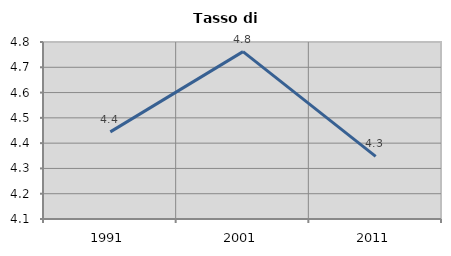
| Category | Tasso di disoccupazione   |
|---|---|
| 1991.0 | 4.444 |
| 2001.0 | 4.762 |
| 2011.0 | 4.348 |